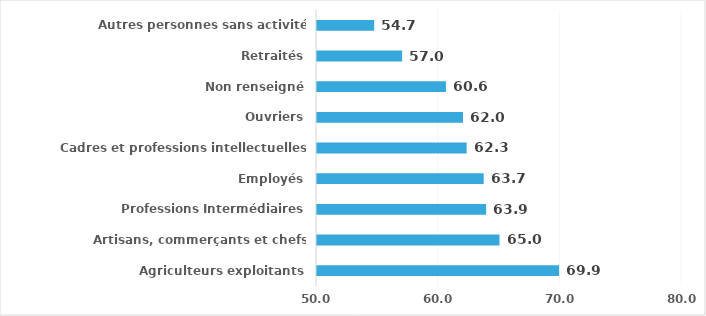
| Category | Series 0 |
|---|---|
| Agriculteurs exploitants | 69.9 |
| Artisans, commerçants et chefs d'entreprise | 65 |
| Professions Intermédiaires | 63.9 |
| Employés | 63.7 |
| Cadres et professions intellectuelles supérieures | 62.3 |
| Ouvriers | 62 |
| Non renseigné | 60.6 |
| Retraités | 57 |
| Autres personnes sans activité professionnelle | 54.7 |